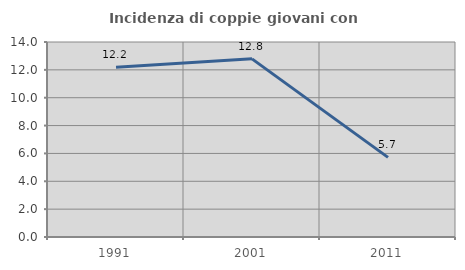
| Category | Incidenza di coppie giovani con figli |
|---|---|
| 1991.0 | 12.179 |
| 2001.0 | 12.791 |
| 2011.0 | 5.714 |